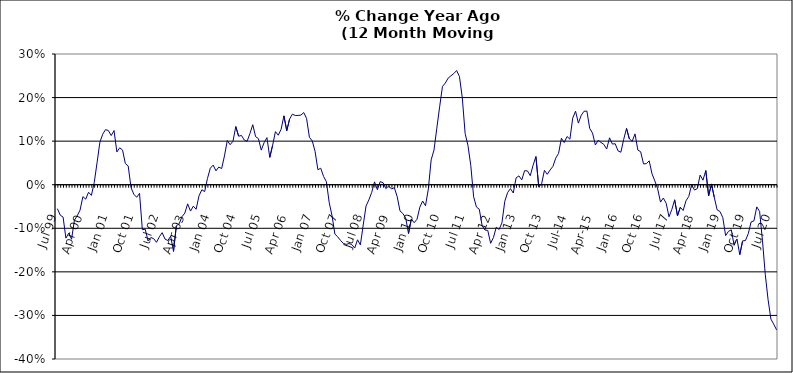
| Category | Series 0 |
|---|---|
| Jul 99 | -0.055 |
| Aug 99 | -0.07 |
| Sep 99 | -0.074 |
| Oct 99 | -0.123 |
| Nov 99 | -0.111 |
| Dec 99 | -0.125 |
| Jan 00 | -0.082 |
| Feb 00 | -0.071 |
| Mar 00 | -0.058 |
| Apr 00 | -0.027 |
| May 00 | -0.033 |
| Jun 00 | -0.017 |
| Jul 00 | -0.025 |
| Aug 00 | 0.005 |
| Sep 00 | 0.05 |
| Oct 00 | 0.098 |
| Nov 00 | 0.116 |
| Dec 00 | 0.127 |
| Jan 01 | 0.124 |
| Feb 01 | 0.113 |
| Mar 01 | 0.124 |
| Apr 01 | 0.075 |
| May 01 | 0.085 |
| Jun 01 | 0.08 |
| Jul 01 | 0.048 |
| Aug 01 | 0.043 |
| Sep 01 | -0.007 |
| Oct 01 | -0.022 |
| Nov 01 | -0.029 |
| Dec 01 | -0.02 |
| Jan 02 | -0.103 |
| Feb 02 | -0.102 |
| Mar 02 | -0.129 |
| Apr 02 | -0.121 |
| May 02 | -0.124 |
| Jun 02 | -0.132 |
| Jul 02 | -0.119 |
| Aug 02 | -0.11 |
| Sep 02 | -0.125 |
| Oct 02 | -0.128 |
| Nov 02 | -0.118 |
| Dec 02 | -0.153 |
| Jan 03 | -0.094 |
| Feb 03 | -0.09 |
| Mar 03 | -0.073 |
| Apr 03 | -0.065 |
| May 03 | -0.044 |
| Jun 03 | -0.06 |
| Jul 03 | -0.049 |
| Aug 03 | -0.056 |
| Sep 03 | -0.026 |
| Oct 03 | -0.012 |
| Nov 03 | -0.016 |
| Dec 03 | 0.014 |
| Jan 04 | 0.038 |
| Feb 04 | 0.045 |
| Mar 04 | 0.032 |
| Apr 04 | 0.041 |
| May 04 | 0.037 |
| Jun 04 | 0.066 |
| Jul 04 | 0.101 |
| Aug 04 | 0.092 |
| Sep 04 | 0.1 |
| Oct 04 | 0.133 |
| Nov 04 | 0.111 |
| Dec 04 | 0.113 |
| Jan 05 | 0.103 |
| Feb 05 | 0.1 |
| Mar 05 | 0.118 |
| Apr 05 | 0.138 |
| May 05 | 0.11 |
| Jun 05 | 0.106 |
| Jul 05 | 0.079 |
| Aug 05 | 0.097 |
| Sep 05 | 0.108 |
| Oct 05 | 0.063 |
| Nov 05 | 0.09 |
| Dec 05 | 0.122 |
| Jan 06 | 0.114 |
| Feb 06 | 0.127 |
| Mar 06 | 0.158 |
| Apr 06 | 0.124 |
| May 06 | 0.151 |
| Jun 06 | 0.162 |
| Jul 06 | 0.159 |
| Aug 06 | 0.159 |
| Sep 06 | 0.16 |
| Oct 06 | 0.166 |
| Nov 06 | 0.152 |
| Dec 06 | 0.109 |
| Jan 07 | 0.101 |
| Feb 07 | 0.076 |
| Mar 07 | 0.034 |
| Apr 07 | 0.038 |
| May 07 | 0.019 |
| Jun 07 | 0.007 |
| Jul 07 | -0.041 |
| Aug 07 | -0.071 |
| Sep 07 | -0.113 |
| Oct 07 | -0.12 |
| Nov 07 | -0.128 |
| Dec 07 | -0.135 |
| Jan 08 | -0.137 |
| Feb 08 | -0.135 |
| Mar 08 | -0.137 |
| Apr 08 | -0.145 |
| May 08 | -0.126 |
| Jun 08 | -0.138 |
| Jul 08 | -0.093 |
| Aug 08 | -0.049 |
| Sep-08 | -0.035 |
| Oct 08 | -0.018 |
| Nov 08 | 0.007 |
| Dec 08 | -0.011 |
| Jan 09 | 0.007 |
| Feb 09 | 0.005 |
| Mar 09 | -0.009 |
| Apr 09 | -0.003 |
| May 09 | -0.01 |
| Jun 09 | -0.007 |
| Jul 09 | -0.027 |
| Aug 09 | -0.06 |
| Sep 09 | -0.066 |
| Oct 09 | -0.076 |
| Nov 09 | -0.112 |
| Dec 09 | -0.079 |
| Jan 10 | -0.087 |
| Feb 10 | -0.079 |
| Mar 10 | -0.052 |
| Apr 10 | -0.037 |
| May 10 | -0.048 |
| Jun 10 | -0.01 |
| Jul 10 | 0.057 |
| Aug 10 | 0.08 |
| Sep 10 | 0.13 |
| Oct 10 | 0.179 |
| Nov 10 | 0.226 |
| Dec 10 | 0.233 |
| Jan 11 | 0.245 |
| Feb 11 | 0.25 |
| Mar 11 | 0.255 |
| Apr 11 | 0.262 |
| May 11 | 0.248 |
| Jun 11 | 0.199 |
| Jul 11 | 0.118 |
| Aug 11 | 0.09 |
| Sep 11 | 0.044 |
| Oct 11 | -0.028 |
| Nov 11 | -0.051 |
| Dec 11 | -0.056 |
| Jan 12 | -0.094 |
| Feb 12 | -0.104 |
| Mar 12 | -0.105 |
| Apr 12 | -0.134 |
| May 12 | -0.121 |
| Jun 12 | -0.098 |
| Jul 12 | -0.103 |
| Aug 12 | -0.087 |
| Sep 12 | -0.038 |
| Oct 12 | -0.018 |
| Nov 12 | -0.009 |
| Dec 12 | -0.019 |
| Jan 13 | 0.016 |
| Feb-13 | 0.02 |
| Mar-13 | 0.011 |
| Apr 13 | 0.032 |
| May 13 | 0.032 |
| Jun-13 | 0.021 |
| Jul 13 | 0.045 |
| Aug 13 | 0.065 |
| Sep 13 | -0.005 |
| Oct 13 | 0.002 |
| Nov 13 | 0.033 |
| Dec 13 | 0.024 |
| Jan 14 | 0.034 |
| Feb-14 | 0.042 |
| Mar 14 | 0.061 |
| Apr 14 | 0.072 |
| May 14 | 0.107 |
| Jun 14 | 0.097 |
| Jul-14 | 0.111 |
| Aug-14 | 0.105 |
| Sep 14 | 0.153 |
| Oct 14 | 0.169 |
| Nov 14 | 0.141 |
| Dec 14 | 0.159 |
| Jan 15 | 0.169 |
| Feb 15 | 0.169 |
| Mar 15 | 0.129 |
| Apr-15 | 0.118 |
| May 15 | 0.091 |
| Jun-15 | 0.102 |
| Jul 15 | 0.097 |
| Aug 15 | 0.092 |
| Sep 15 | 0.082 |
| Oct 15 | 0.108 |
| Nov 15 | 0.093 |
| Dec 15 | 0.094 |
| Jan 16 | 0.078 |
| Feb 16 | 0.075 |
| Mar 16 | 0.104 |
| Apr 16 | 0.129 |
| May 16 | 0.105 |
| Jun 16 | 0.1 |
| Jul 16 | 0.117 |
| Aug 16 | 0.08 |
| Sep 16 | 0.076 |
| Oct 16 | 0.048 |
| Nov 16 | 0.048 |
| Dec 16 | 0.055 |
| Jan 17 | 0.025 |
| Feb 17 | 0.009 |
| Mar 17 | -0.01 |
| Apr 17 | -0.04 |
| May 17 | -0.031 |
| Jun 17 | -0.042 |
| Jul 17 | -0.074 |
| Aug 17 | -0.057 |
| Sep 17 | -0.035 |
| Oct 17 | -0.071 |
| Nov 17 | -0.052 |
| Dec 17 | -0.059 |
| Jan 18 | -0.037 |
| Feb 18 | -0.027 |
| Mar 18 | 0 |
| Apr 18 | -0.012 |
| May 18 | -0.009 |
| Jun 18 | 0.022 |
| Jul 18 | 0.01 |
| Aug 18 | 0.033 |
| Sep 18 | -0.025 |
| Oct 18 | 0.002 |
| Nov 18 | -0.029 |
| Dec 18 | -0.058 |
| Jan 19 | -0.061 |
| Feb 19 | -0.075 |
| Mar 19 | -0.117 |
| Apr 19 | -0.107 |
| May 19 | -0.104 |
| Jun 19 | -0.139 |
| Jul 19 | -0.124 |
| Aug 19 | -0.16 |
| Sep 19 | -0.129 |
| Oct 19 | -0.128 |
| Nov 19 | -0.112 |
| Dec 19 | -0.085 |
| Jan 20 | -0.083 |
| Feb 20 | -0.051 |
| Mar 20 | -0.061 |
| Apr 20 | -0.127 |
| May 20 | -0.206 |
| Jun 20 | -0.264 |
| Jul 20 | -0.308 |
| Aug 20 | -0.32 |
| Sep 20 | -0.333 |